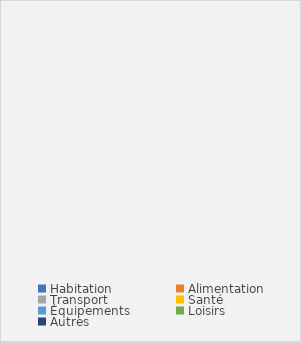
| Category | Series 0 |
|---|---|
| Habitation | 0 |
| Alimentation | 0 |
| Transport | 0 |
| Santé | 0 |
| Équipements | 0 |
| Loisirs | 0 |
| Autres | 0 |